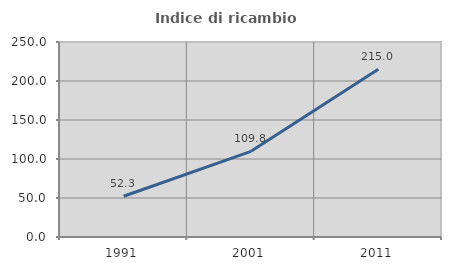
| Category | Indice di ricambio occupazionale  |
|---|---|
| 1991.0 | 52.292 |
| 2001.0 | 109.827 |
| 2011.0 | 214.963 |